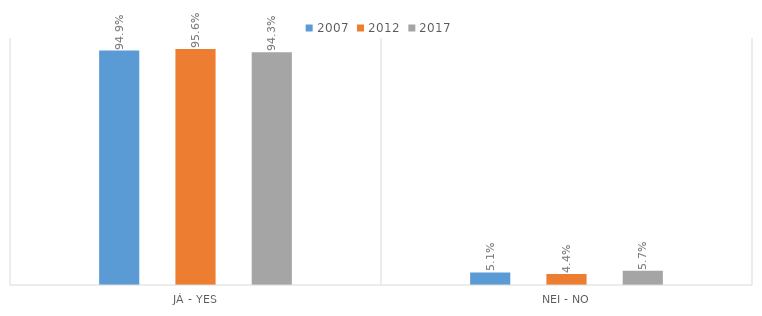
| Category | 2007 | 2012 | 2017 |
|---|---|---|---|
| Já - Yes | 0.949 | 0.956 | 0.943 |
| Nei - No | 0.051 | 0.044 | 0.057 |